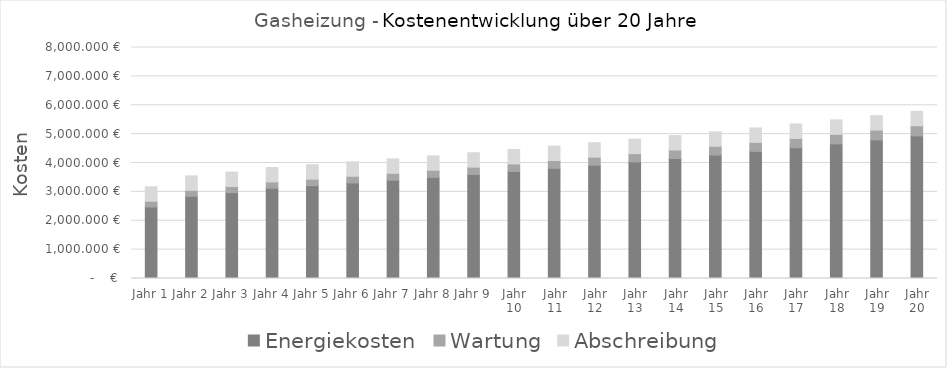
| Category | Energiekosten | Wartung | Abschreibung |
|---|---|---|---|
| Jahr 1 | 2476.564 | 200 | 500 |
| Jahr 2 | 2846.749 | 206 | 500 |
| Jahr 3 | 2974.234 | 212.18 | 500 |
| Jahr 4 | 3125.623 | 218.545 | 500 |
| Jahr 5 | 3215.546 | 225.102 | 500 |
| Jahr 6 | 3308.168 | 231.855 | 500 |
| Jahr 7 | 3403.567 | 238.81 | 500 |
| Jahr 8 | 3501.829 | 245.975 | 500 |
| Jahr 9 | 3603.039 | 253.354 | 500 |
| Jahr 10 | 3707.285 | 260.955 | 500 |
| Jahr 11 | 3814.659 | 268.783 | 500 |
| Jahr 12 | 3925.254 | 276.847 | 500 |
| Jahr 13 | 4039.166 | 285.152 | 500 |
| Jahr 14 | 4156.496 | 293.707 | 500 |
| Jahr 15 | 4277.346 | 302.518 | 500 |
| Jahr 16 | 4401.821 | 311.593 | 500 |
| Jahr 17 | 4530.031 | 320.941 | 500 |
| Jahr 18 | 4662.087 | 330.57 | 500 |
| Jahr 19 | 4798.104 | 340.487 | 500 |
| Jahr 20 | 4938.202 | 350.701 | 500 |